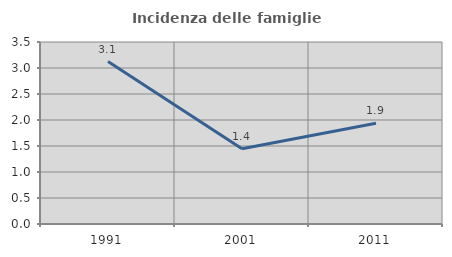
| Category | Incidenza delle famiglie numerose |
|---|---|
| 1991.0 | 3.125 |
| 2001.0 | 1.447 |
| 2011.0 | 1.938 |